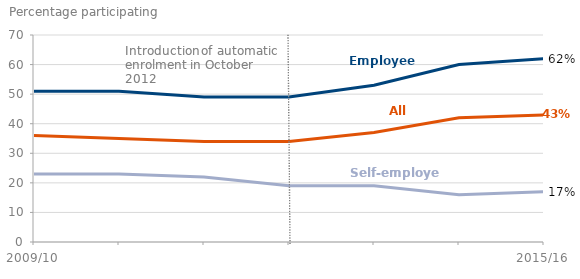
| Category | Employees | Self-employed | All |
|---|---|---|---|
| 2009/10 | 51 | 23 | 36 |
| 2010/11 | 51 | 23 | 35 |
| 2011/12 | 49 | 22 | 34 |
| 2012/13 | 49 | 19 | 34 |
| 2013/14 | 53 | 19 | 37 |
| 2014/15 | 60 | 16 | 42 |
| 2015/16 | 62 | 17 | 43 |